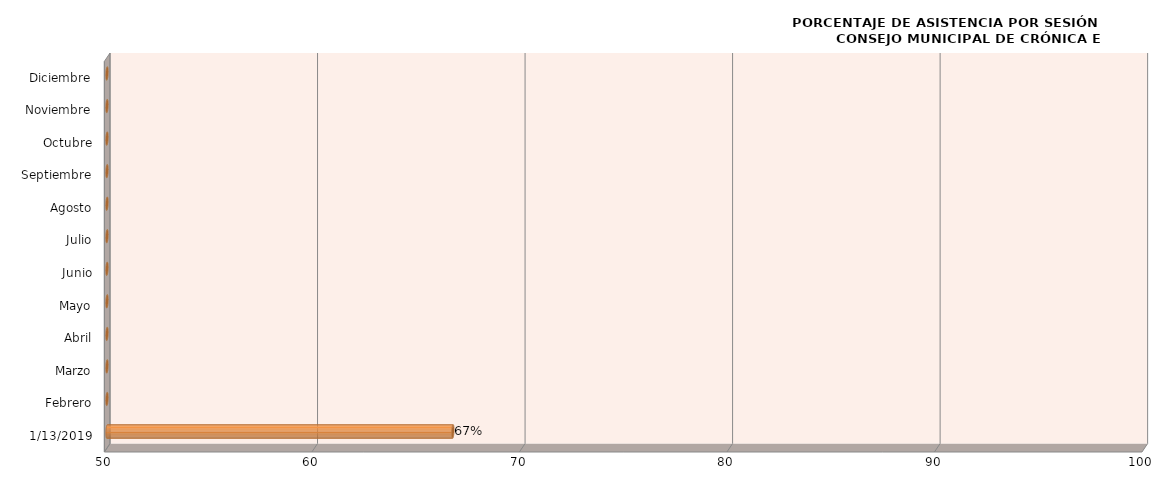
| Category | Series 0 |
|---|---|
| 13/01/2019 | 66.667 |
| Febrero | 0 |
| Marzo | 0 |
| Abril | 0 |
| Mayo | 0 |
| Junio | 0 |
| Julio | 0 |
| Agosto | 0 |
| Septiembre | 0 |
| Octubre | 0 |
| Noviembre | 0 |
| Diciembre | 0 |